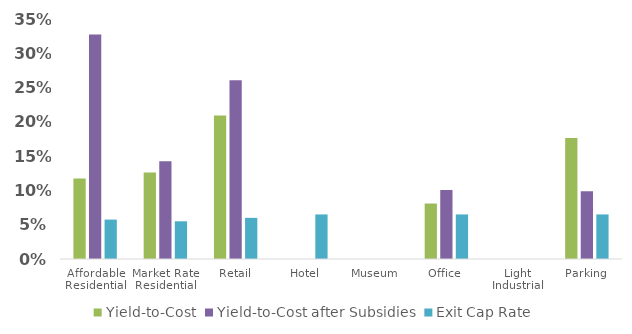
| Category | Yield-to-Cost | Yield-to-Cost after Subsidies | Exit Cap Rate |
|---|---|---|---|
| Affordable Residential | 0.118 | 0.327 | 0.058 |
| Market Rate Residential | 0.126 | 0.143 | 0.055 |
| Retail | 0.209 | 0.261 | 0.06 |
| Hotel | 0 | 0 | 0.065 |
| Museum | 0 | 0 | 0 |
| Office | 0.081 | 0.101 | 0.065 |
| Light Industrial | 0 | 0 | 0 |
| Parking | 0.177 | 0.099 | 0.065 |